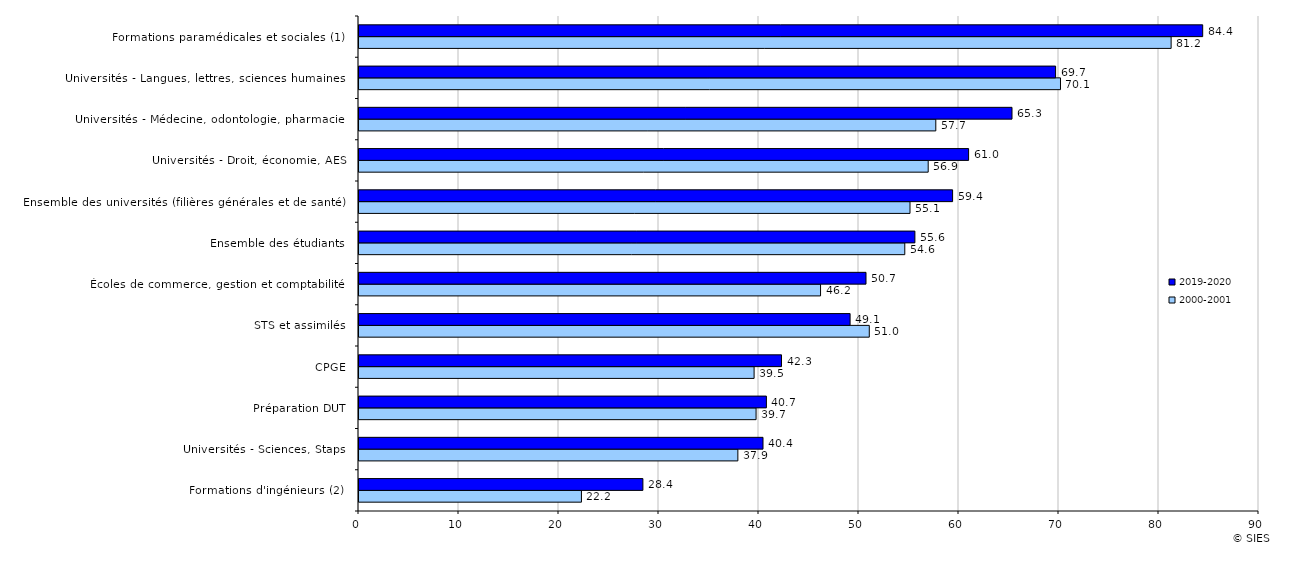
| Category | 2000-2001 | 2019-2020 |
|---|---|---|
| Formations d'ingénieurs (2) | 22.244 | 28.39 |
| Universités - Sciences, Staps | 37.887 | 40.4 |
| Préparation DUT | 39.707 | 40.74 |
| CPGE | 39.51 | 42.25 |
| STS et assimilés | 51.028 | 49.11 |
| Écoles de commerce, gestion et comptabilité | 46.156 | 50.7 |
| Ensemble des étudiants | 54.579 | 55.59 |
| Ensemble des universités (filières générales et de santé) | 55.1 | 59.36 |
| Universités - Droit, économie, AES | 56.919 | 60.96 |
| Universités - Médecine, odontologie, pharmacie | 57.681 | 65.3 |
| Universités - Langues, lettres, sciences humaines | 70.149 | 69.66 |
| Formations paramédicales et sociales (1) | 81.213 | 84.37 |